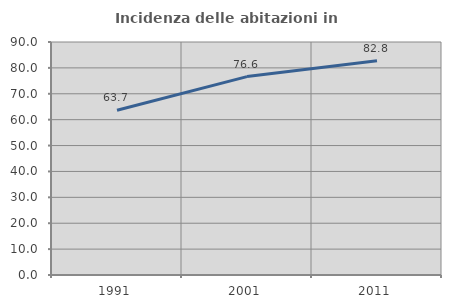
| Category | Incidenza delle abitazioni in proprietà  |
|---|---|
| 1991.0 | 63.653 |
| 2001.0 | 76.631 |
| 2011.0 | 82.778 |